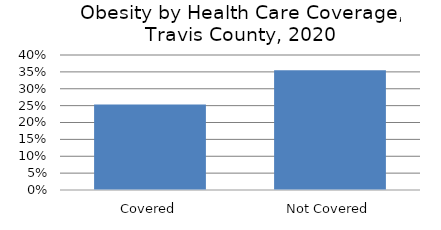
| Category | Series 0 |
|---|---|
| Covered | 0.253 |
| Not Covered | 0.355 |